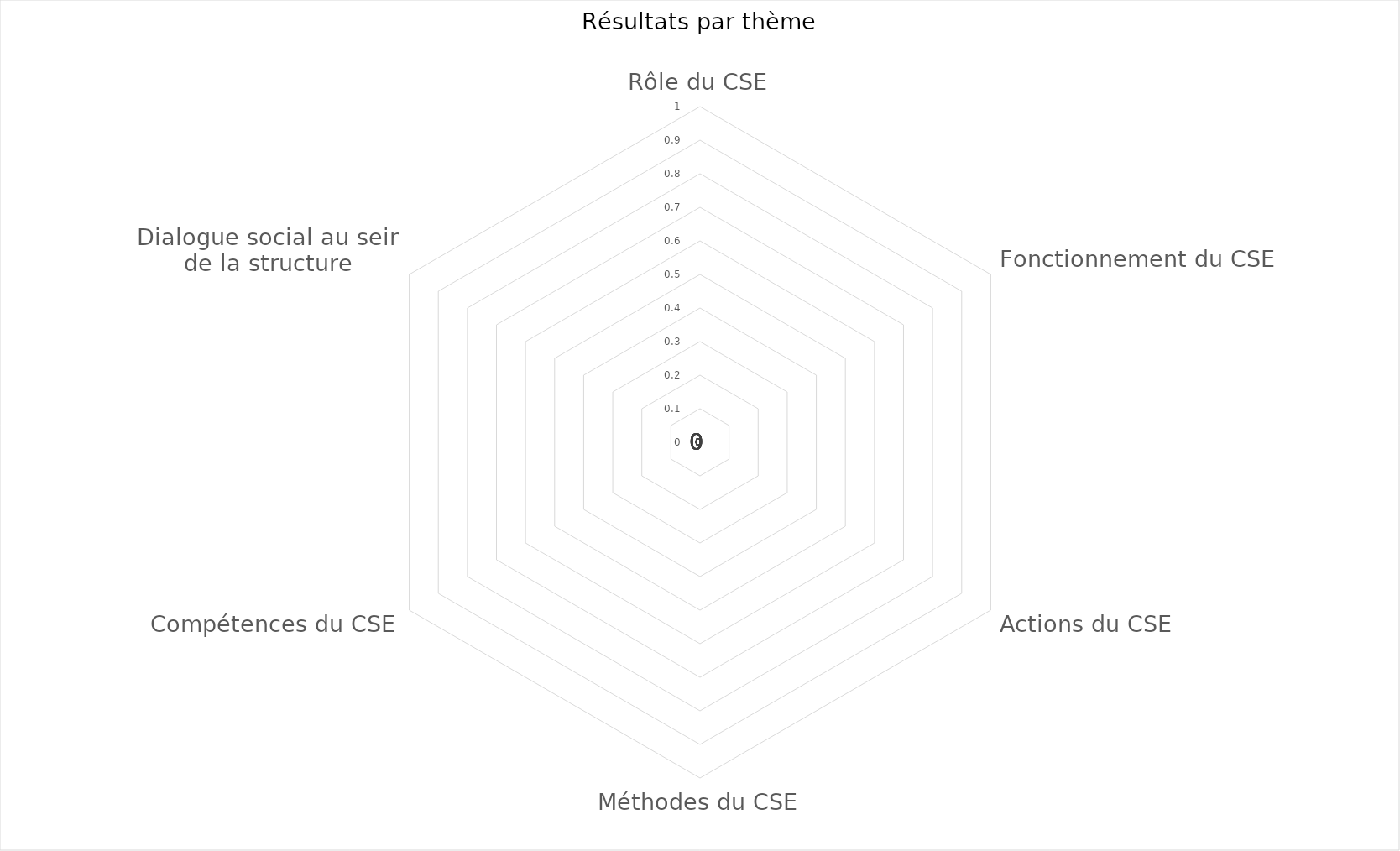
| Category | Series 0 | Series 1 | Series 2 | Series 3 | Series 4 | Series 5 |
|---|---|---|---|---|---|---|
| Rôle du CSE |  |  |  |  |  | 0 |
| Fonctionnement du CSE |  |  |  |  |  | 0 |
| Actions du CSE |  |  |  |  |  | 0 |
| Méthodes du CSE |  |  |  |  |  | 0 |
| Compétences du CSE |  |  |  |  |  | 0 |
| Dialogue social au sein de la structure |  |  |  |  |  | 0 |